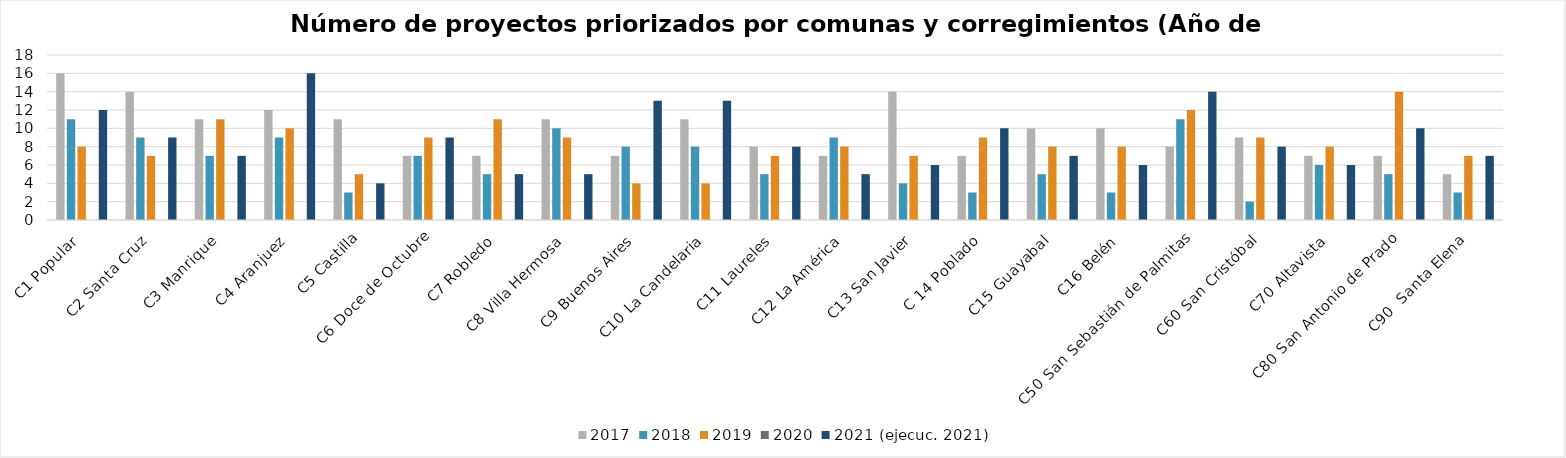
| Category | 2017 | 2018 | 2019 | 2020 | 2021 (ejecuc. 2021) |
|---|---|---|---|---|---|
| C1 Popular | 16 | 11 | 8 |  | 12 |
| C2 Santa Cruz | 14 | 9 | 7 |  | 9 |
| C3 Manrique | 11 | 7 | 11 |  | 7 |
| C4 Aranjuez | 12 | 9 | 10 |  | 16 |
| C5 Castilla | 11 | 3 | 5 |  | 4 |
| C6 Doce de Octubre | 7 | 7 | 9 |  | 9 |
| C7 Robledo | 7 | 5 | 11 |  | 5 |
| C8 Villa Hermosa | 11 | 10 | 9 |  | 5 |
| C9 Buenos Aires | 7 | 8 | 4 |  | 13 |
| C10 La Candelaria | 11 | 8 | 4 |  | 13 |
| C11 Laureles | 8 | 5 | 7 |  | 8 |
| C12 La América | 7 | 9 | 8 |  | 5 |
| C13 San Javier | 14 | 4 | 7 |  | 6 |
| C 14 Poblado | 7 | 3 | 9 |  | 10 |
| C15 Guayabal | 10 | 5 | 8 |  | 7 |
| C16 Belén | 10 | 3 | 8 |  | 6 |
| C50 San Sebastián de Palmitas  | 8 | 11 | 12 |  | 14 |
| C60 San Cristóbal | 9 | 2 | 9 |  | 8 |
| C70 Altavista | 7 | 6 | 8 |  | 6 |
| C80 San Antonio de Prado | 7 | 5 | 14 |  | 10 |
| C90  Santa Elena | 5 | 3 | 7 |  | 7 |